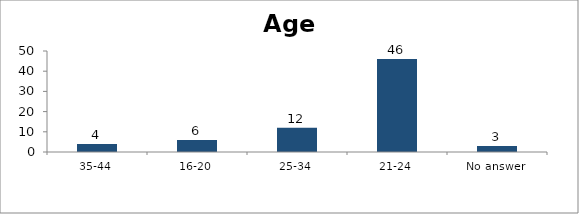
| Category | Age |
|---|---|
| 35-44 | 4 |
| 16-20 | 6 |
| 25-34 | 12 |
| 21-24 | 46 |
| No answer | 3 |